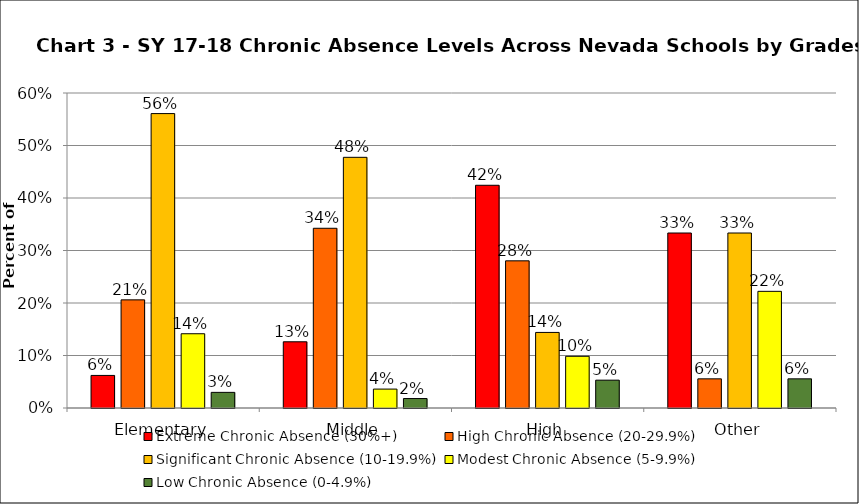
| Category | Extreme Chronic Absence (30%+) | High Chronic Absence (20-29.9%) | Significant Chronic Absence (10-19.9%) | Modest Chronic Absence (5-9.9%) | Low Chronic Absence (0-4.9%) |
|---|---|---|---|---|---|
| 0 | 0.062 | 0.206 | 0.561 | 0.141 | 0.03 |
| 1 | 0.126 | 0.342 | 0.477 | 0.036 | 0.018 |
| 2 | 0.424 | 0.28 | 0.144 | 0.098 | 0.053 |
| 3 | 0.333 | 0.056 | 0.333 | 0.222 | 0.056 |